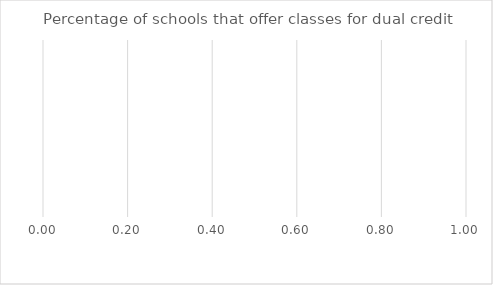
| Category | Benchmark | Entire LEA  | Title IV-A Identified Schools |
|---|---|---|---|
| Percentage of schools that offer classes for dual credit | 0 | 0 | 0 |